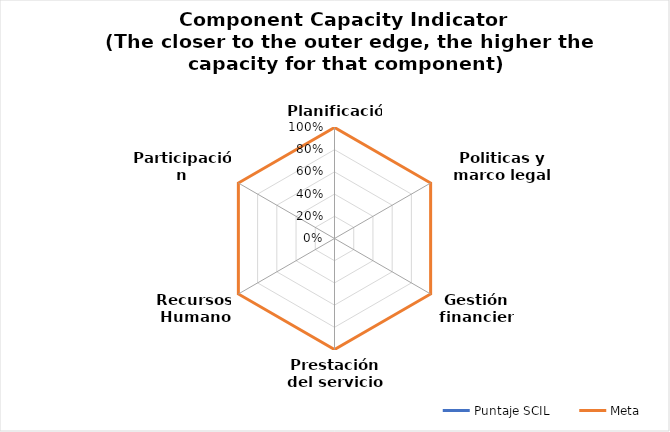
| Category | Puntaje SCIL | Meta |
|---|---|---|
| Planificación | 0 | 1 |
| Politicas y marco legal | 0 | 1 |
| Gestión financiera | 0 | 1 |
| Prestación del servicio | 0 | 1 |
| Recursos Humanos | 0 | 1 |
| Participación comunitaria | 0 | 1 |